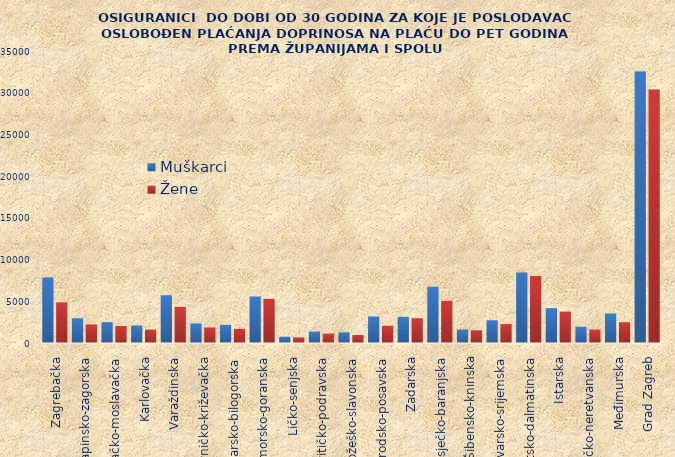
| Category | Muškarci | Žene |
|---|---|---|
| Zagrebačka | 7844 | 4872 |
| Krapinsko-zagorska | 2970 | 2224 |
| Sisačko-moslavačka | 2498 | 2039 |
| Karlovačka | 2085 | 1601 |
| Varaždinska | 5722 | 4326 |
| Koprivničko-križevačka | 2348 | 1862 |
| Bjelovarsko-bilogorska | 2175 | 1696 |
| Primorsko-goranska | 5566 | 5293 |
| Ličko-senjska | 750 | 656 |
| Virovitičko-podravska | 1368 | 1110 |
| Požeško-slavonska | 1268 | 962 |
| Brodsko-posavska | 3180 | 2059 |
| Zadarska | 3133 | 2969 |
| Osječko-baranjska | 6736 | 5052 |
| Šibensko-kninska | 1607 | 1530 |
| Vukovarsko-srijemska | 2721 | 2273 |
| Splitsko-dalmatinska | 8440 | 8040 |
| Istarska | 4177 | 3758 |
| Dubrovačko-neretvanska | 1941 | 1603 |
| Međimurska | 3537 | 2490 |
| Grad Zagreb | 32538 | 30375 |